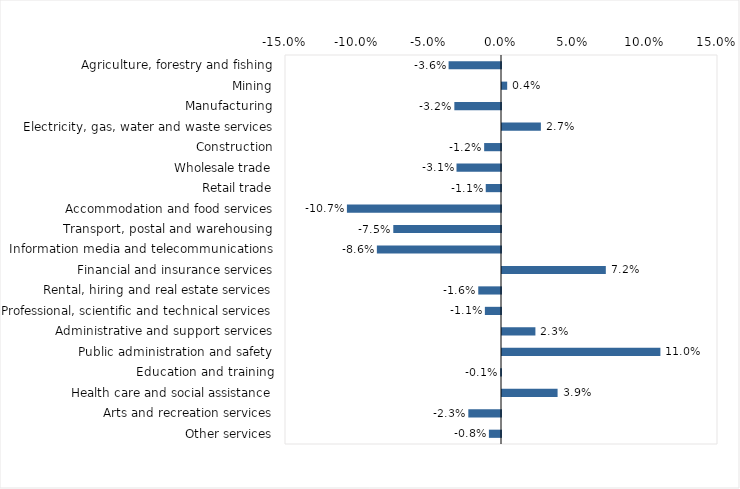
| Category | This week |
|---|---|
| Agriculture, forestry and fishing | -0.036 |
| Mining | 0.004 |
| Manufacturing | -0.032 |
| Electricity, gas, water and waste services | 0.027 |
| Construction | -0.012 |
| Wholesale trade | -0.031 |
| Retail trade | -0.011 |
| Accommodation and food services | -0.107 |
| Transport, postal and warehousing | -0.075 |
| Information media and telecommunications | -0.086 |
| Financial and insurance services | 0.072 |
| Rental, hiring and real estate services | -0.016 |
| Professional, scientific and technical services | -0.011 |
| Administrative and support services | 0.023 |
| Public administration and safety | 0.11 |
| Education and training | -0.001 |
| Health care and social assistance | 0.039 |
| Arts and recreation services | -0.023 |
| Other services | -0.008 |